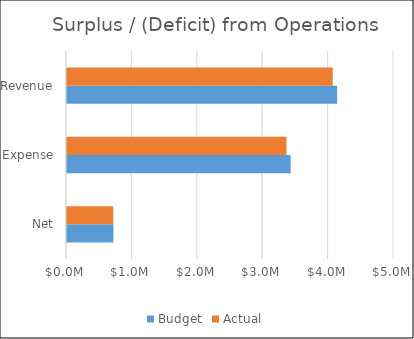
| Category | Budget | Actual |
|---|---|---|
| Net | 710000 | 707600 |
| Expense | 3420000 | 3355400 |
| Revenue | 4130000 | 4063000 |